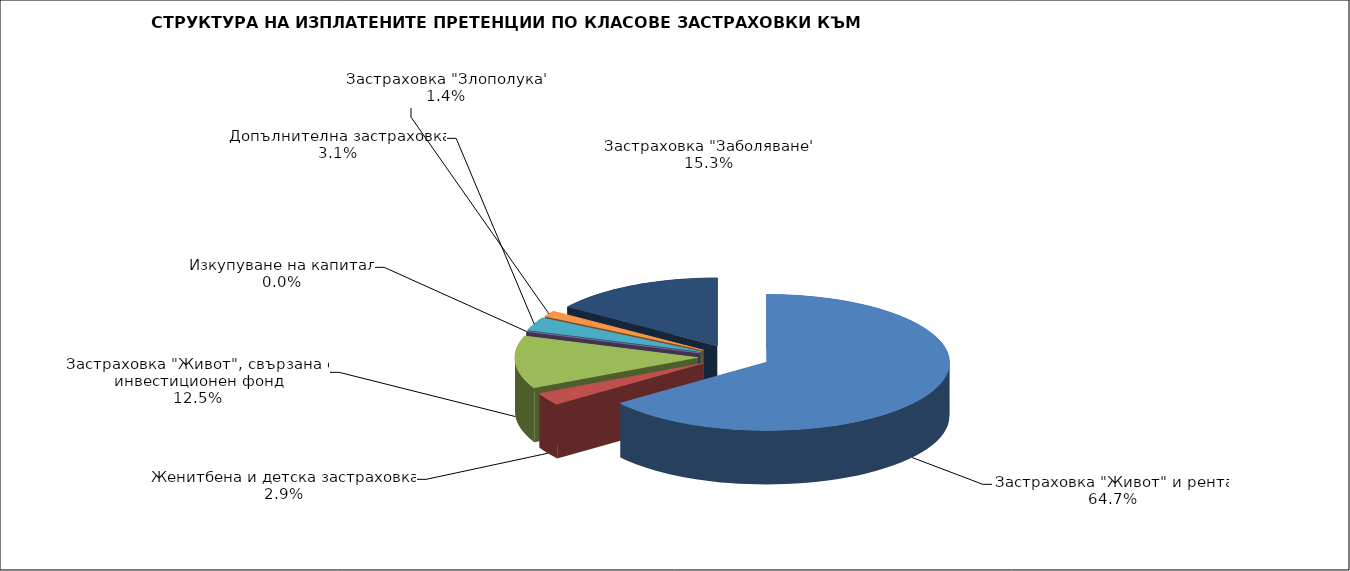
| Category | 76 578 554 |
|---|---|
| Застраховка "Живот" и рента | 76578553.843 |
| Женитбена и детска застраховка | 3454015.309 |
| Застраховка "Живот", свързана с инвестиционен фонд | 14814184.915 |
| Изкупуване на капитал | 0 |
| Допълнителна застраховка | 3712398.786 |
| Застраховка "Злополука" | 1665933.629 |
| Застраховка "Заболяване" | 18106236.306 |